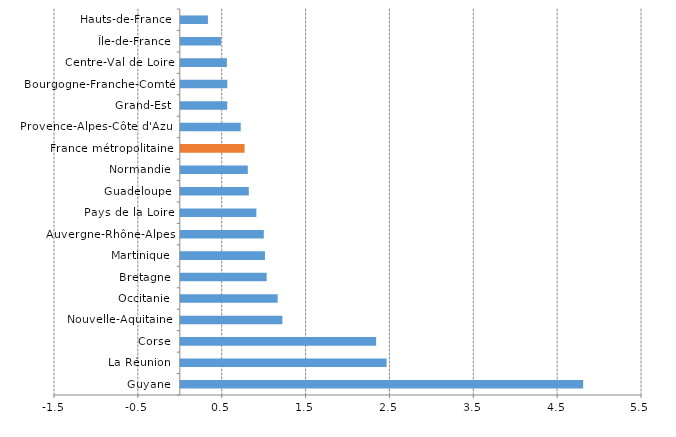
| Category | Series 0 |
|---|---|
| Guyane | 4.798 |
| La Réunion | 2.454 |
| Corse | 2.33 |
| Nouvelle-Aquitaine | 1.211 |
| Occitanie | 1.155 |
| Bretagne | 1.024 |
| Martinique | 1.004 |
| Auvergne-Rhône-Alpes | 0.99 |
| Pays de la Loire | 0.901 |
| Guadeloupe | 0.811 |
| Normandie | 0.799 |
| France métropolitaine | 0.761 |
| Provence-Alpes-Côte d'Azur | 0.715 |
| Grand-Est | 0.554 |
| Bourgogne-Franche-Comté | 0.555 |
| Centre-Val de Loire | 0.55 |
| Île-de-France | 0.479 |
| Hauts-de-France | 0.324 |